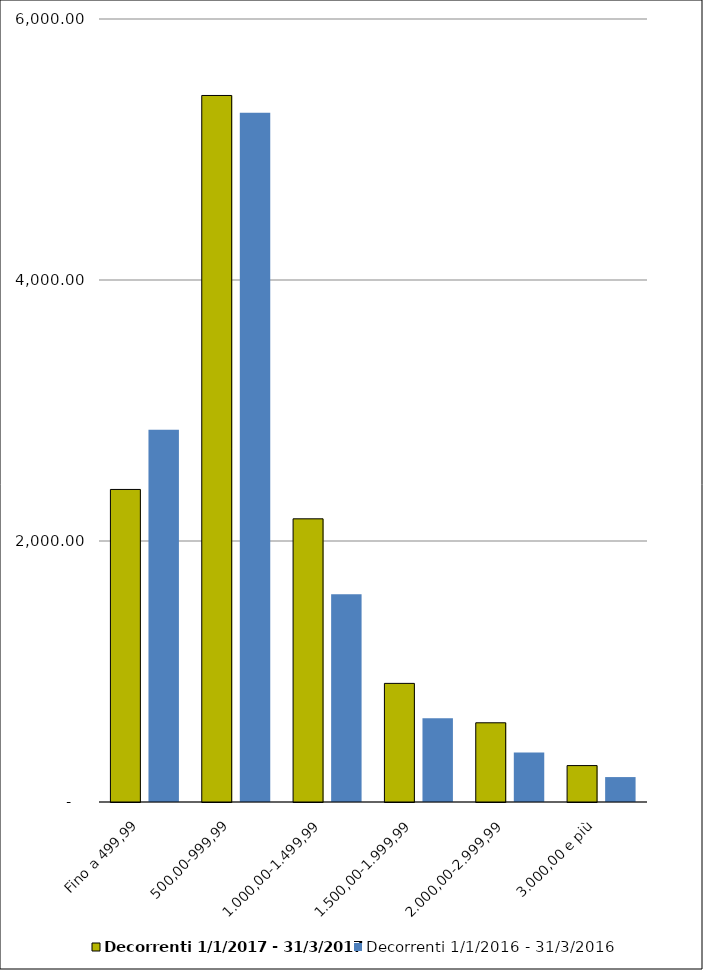
| Category | Decorrenti 1/1/2017 - 31/3/2017 | Decorrenti 1/1/2016 - 31/3/2016 |
|---|---|---|
| Fino a 499,99 | 2395 | 2853 |
| 500,00-999,99 | 5414 | 5281 |
| 1.000,00-1.499,99 | 2170 | 1591 |
| 1.500,00-1.999,99 | 909 | 641 |
| 2.000,00-2.999,99 | 607 | 379 |
| 3.000,00 e più | 279 | 191 |